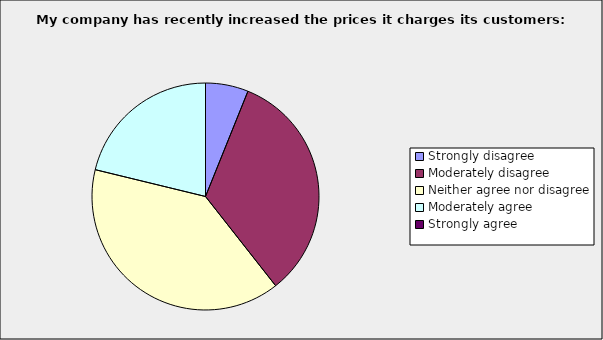
| Category | Series 0 |
|---|---|
| Strongly disagree | 0.061 |
| Moderately disagree | 0.333 |
| Neither agree nor disagree | 0.394 |
| Moderately agree | 0.212 |
| Strongly agree | 0 |